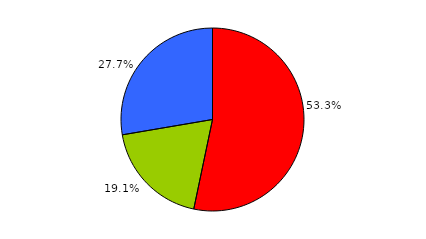
| Category | Series 0 |
|---|---|
| 0 | 154 |
| 1 | 55 |
| 2 | 80 |